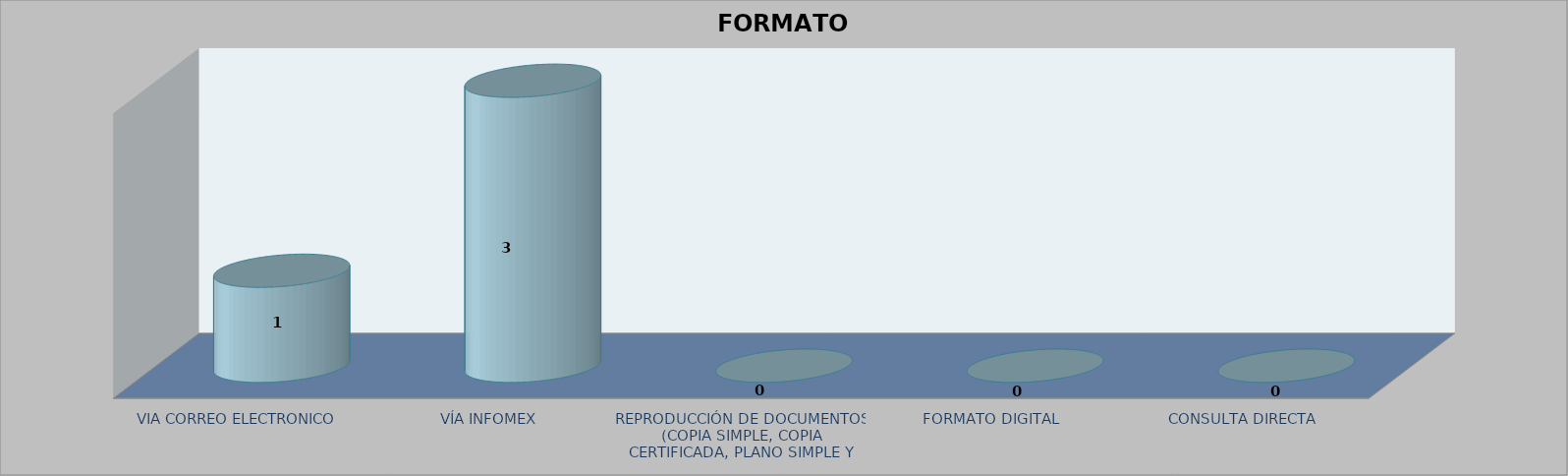
| Category |        FORMATO SOLICITADO | Series 1 | Series 2 |
|---|---|---|---|
| VIA CORREO ELECTRONICO |  |  | 1 |
| VÍA INFOMEX |  |  | 3 |
| REPRODUCCIÓN DE DOCUMENTOS (COPIA SIMPLE, COPIA CERTIFICADA, PLANO SIMPLE Y PLANO CERTIFICADO) |  |  | 0 |
| FORMATO DIGITAL |  |  | 0 |
| CONSULTA DIRECTA |  |  | 0 |